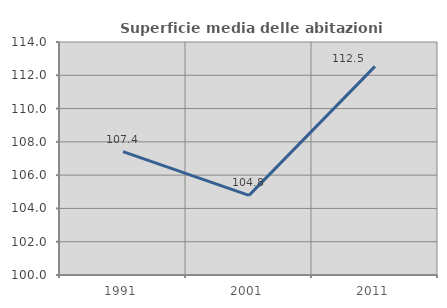
| Category | Superficie media delle abitazioni occupate |
|---|---|
| 1991.0 | 107.415 |
| 2001.0 | 104.787 |
| 2011.0 | 112.534 |